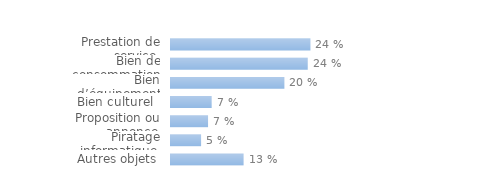
| Category | Series 0 |
|---|---|
| Autres objets | 0.127 |
| Piratage informatique  | 0.053 |
| Proposition ou annonce  | 0.065 |
| Bien culturel  | 0.071 |
| Bien d’équipement | 0.199 |
| Bien de consommation | 0.24 |
| Prestation de service  | 0.245 |